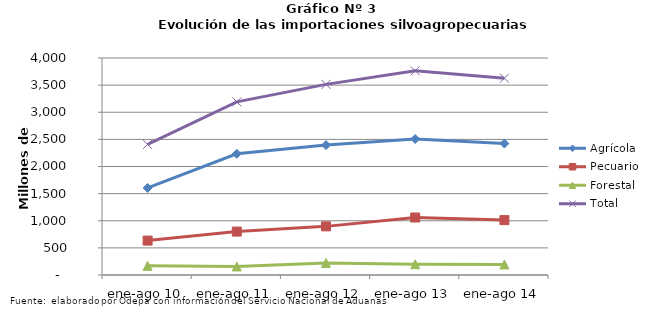
| Category | Agrícola | Pecuario | Forestal | Total |
|---|---|---|---|---|
| ene-ago 10 | 1604591 | 634145 | 168260 | 2406996 |
| ene-ago 11 | 2234010 | 800238 | 157463 | 3191711 |
| ene-ago 12 | 2394740 | 896404 | 222794 | 3513938 |
| ene-ago 13 | 2506656 | 1059952 | 198333 | 3764941 |
| ene-ago 14 | 2423546 | 1011582 | 193597 | 3628725 |